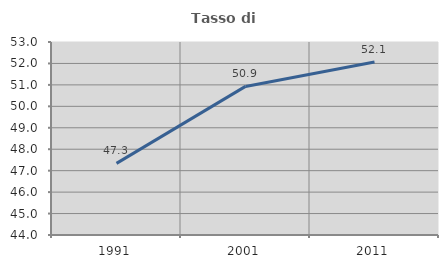
| Category | Tasso di occupazione   |
|---|---|
| 1991.0 | 47.341 |
| 2001.0 | 50.929 |
| 2011.0 | 52.063 |